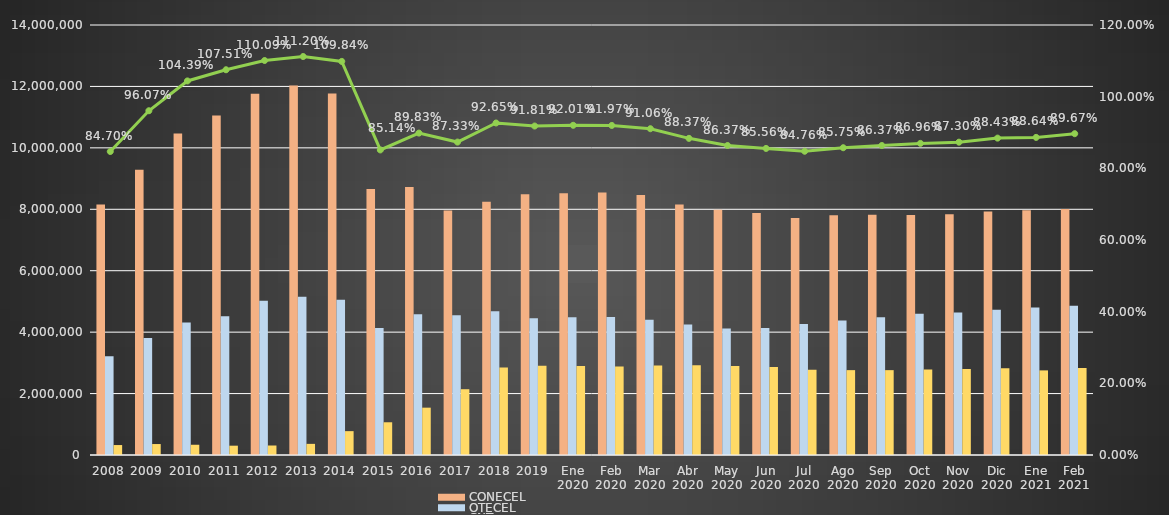
| Category | CONECEL | OTECEL | CNT |
|---|---|---|---|
| 2008 | 8156359 | 3211922 | 323967 |
| 2009 | 9291268 | 3806432 | 356900 |
| 2010 | 10470502 | 4314599 | 333730 |
| 2011 | 11057316 | 4513874 | 303368 |
| 2012 | 11757906 | 5019686 | 309271 |
| 2013 | 12030886 | 5148308 | 362560 |
| 2014 | 11772020 | 5055645 | 776892 |
| 2015 | 8658619 | 4134698 | 1065703 |
| 2016 | 8726823 | 4580092 | 1541219 |
| 2017 | 7960263 | 4549024 | 2142117 |
| 2018 | 8248050 | 4679646 | 2845142 |
| 2019 | 8493054 | 4456356 | 2903690 |
| Ene 2020 | 8524942 | 4485778 | 2896237 |
| Feb 2020 | 8547436 | 4491497 | 2879525 |
| Mar 2020 | 8465092 | 4404214 | 2909915 |
| Abr 2020 | 8157884 | 4251952 | 2921050 |
| May 2020 | 7987799 | 4115703 | 2898420 |
| Jun 2020 | 7877571 | 4134378 | 2865827 |
| Jul 2020 | 7718071 | 4266563 | 2772437 |
| Ago 2020 | 7806588 | 4375909 | 2763303 |
| Sep 2020 | 7821877 | 4486010 | 2762939 |
| Oct 2020 | 7810241 | 4601855 | 2780545 |
| Nov 2020 | 7836096 | 4636163 | 2797069 |
| Dic 2020 | 7929253 | 4729725 | 2826388 |
| Ene 2021 | 7965274 | 4800608 | 2755177 |
| Feb 2021 | 8012894 | 4856877 | 2831764 |